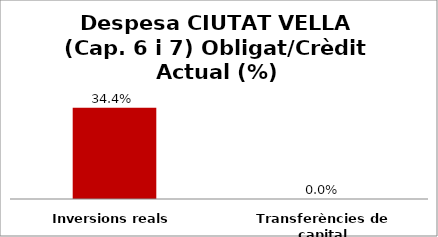
| Category | Series 0 |
|---|---|
| Inversions reals | 0.344 |
| Transferències de capital | 0 |